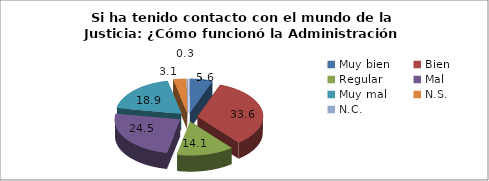
| Category | % |
|---|---|
| Muy bien  | 5.6 |
| Bien | 33.6 |
| Regular | 14.1 |
| Mal  | 24.5 |
| Muy mal | 18.9 |
| N.S.  | 3.1 |
| N.C.  | 0.3 |